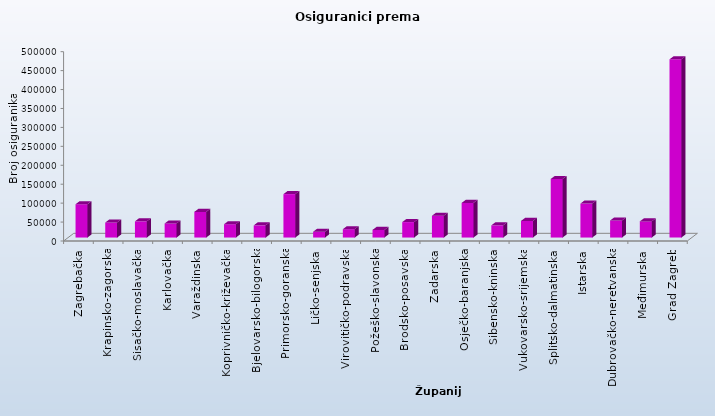
| Category | Series 0 |
|---|---|
| Zagrebačka | 87969 |
| Krapinsko-zagorska | 39678 |
| Sisačko-moslavačka | 42767 |
| Karlovačka | 37079 |
| Varaždinska | 67752 |
| Koprivničko-križevačka | 35175 |
| Bjelovarsko-bilogorska | 32129 |
| Primorsko-goranska | 114702 |
| Ličko-senjska | 15310 |
| Virovitičko-podravska | 22016 |
| Požeško-slavonska | 20106 |
| Brodsko-posavska | 40775 |
| Zadarska | 57465 |
| Osječko-baranjska | 91455 |
| Šibensko-kninska | 32239 |
| Vukovarsko-srijemska | 43833 |
| Splitsko-dalmatinska | 154669 |
| Istarska | 89768 |
| Dubrovačko-neretvanska | 45000 |
| Međimurska | 42573 |
| Grad Zagreb | 470671 |